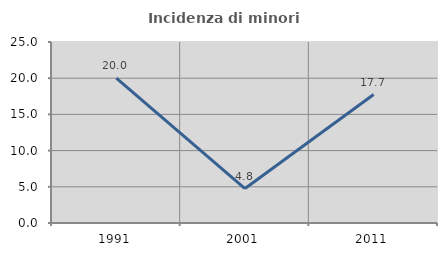
| Category | Incidenza di minori stranieri |
|---|---|
| 1991.0 | 20 |
| 2001.0 | 4.762 |
| 2011.0 | 17.742 |